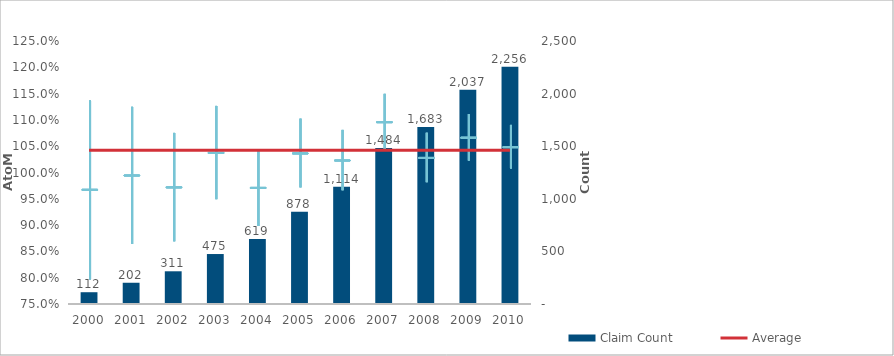
| Category | Claim Count |
|---|---|
| 0 | 112 |
| 1 | 202 |
| 2 | 311 |
| 3 | 475 |
| 4 | 619 |
| 5 | 878 |
| 6 | 1114 |
| 7 | 1484 |
| 8 | 1683 |
| 9 | 2037 |
| 10 | 2256 |